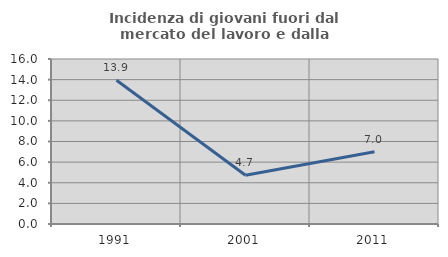
| Category | Incidenza di giovani fuori dal mercato del lavoro e dalla formazione  |
|---|---|
| 1991.0 | 13.932 |
| 2001.0 | 4.724 |
| 2011.0 | 7.009 |